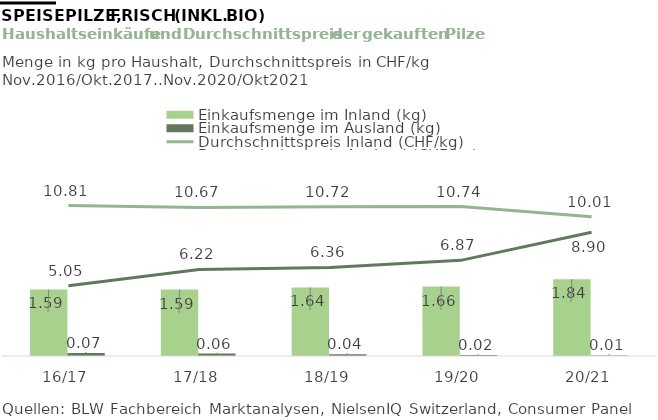
| Category | Einkaufsmenge im Inland (kg) | Einkaufsmenge im Ausland (kg) |
|---|---|---|
| 16/17 | 1.593 | 0.07 |
| 17/18 | 1.591 | 0.057 |
| 18/19 | 1.642 | 0.041 |
| 19/20 | 1.664 | 0.021 |
| 20/21 | 1.837 | 0.014 |